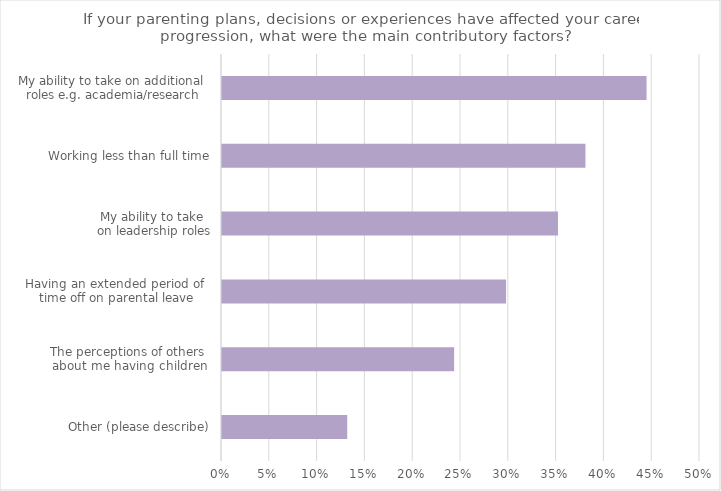
| Category | Series 0 |
|---|---|
| Other (please describe) | 0.131 |
| The perceptions of others 
about me having children | 0.243 |
| Having an extended period of 
time off on parental leave | 0.297 |
| My ability to take 
on leadership roles | 0.351 |
| Working less than full time | 0.38 |
| My ability to take on additional 
roles e.g. academia/research | 0.444 |